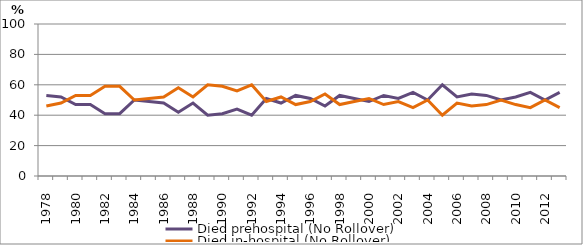
| Category | Died prehospital (No Rollover) | Died in-hospital (No Rollover) |
|---|---|---|
| 1978.0 | 53 | 46 |
| 1979.0 | 52 | 48 |
| 1980.0 | 47 | 53 |
| 1981.0 | 47 | 53 |
| 1982.0 | 41 | 59 |
| 1983.0 | 41 | 59 |
| 1984.0 | 50 | 50 |
| 1985.0 | 49 | 51 |
| 1986.0 | 48 | 52 |
| 1987.0 | 42 | 58 |
| 1988.0 | 48 | 52 |
| 1989.0 | 40 | 60 |
| 1990.0 | 41 | 59 |
| 1991.0 | 44 | 56 |
| 1992.0 | 40 | 60 |
| 1993.0 | 51 | 49 |
| 1994.0 | 48 | 52 |
| 1995.0 | 53 | 47 |
| 1996.0 | 51 | 49 |
| 1997.0 | 46 | 54 |
| 1998.0 | 53 | 47 |
| 1999.0 | 51 | 49 |
| 2000.0 | 49 | 51 |
| 2001.0 | 53 | 47 |
| 2002.0 | 51 | 49 |
| 2003.0 | 55 | 45 |
| 2004.0 | 50 | 50 |
| 2005.0 | 60 | 40 |
| 2006.0 | 52 | 48 |
| 2007.0 | 54 | 46 |
| 2008.0 | 53 | 47 |
| 2009.0 | 50 | 50 |
| 2010.0 | 52 | 47 |
| 2011.0 | 55 | 45 |
| 2012.0 | 50 | 50 |
| 2013.0 | 55 | 45 |